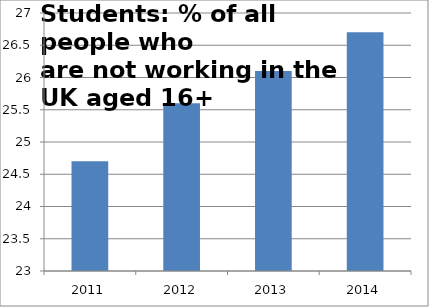
| Category | Student |
|---|---|
| 2011.0 | 24.7 |
| 2012.0 | 25.6 |
| 2013.0 | 26.1 |
| 2014.0 | 26.7 |